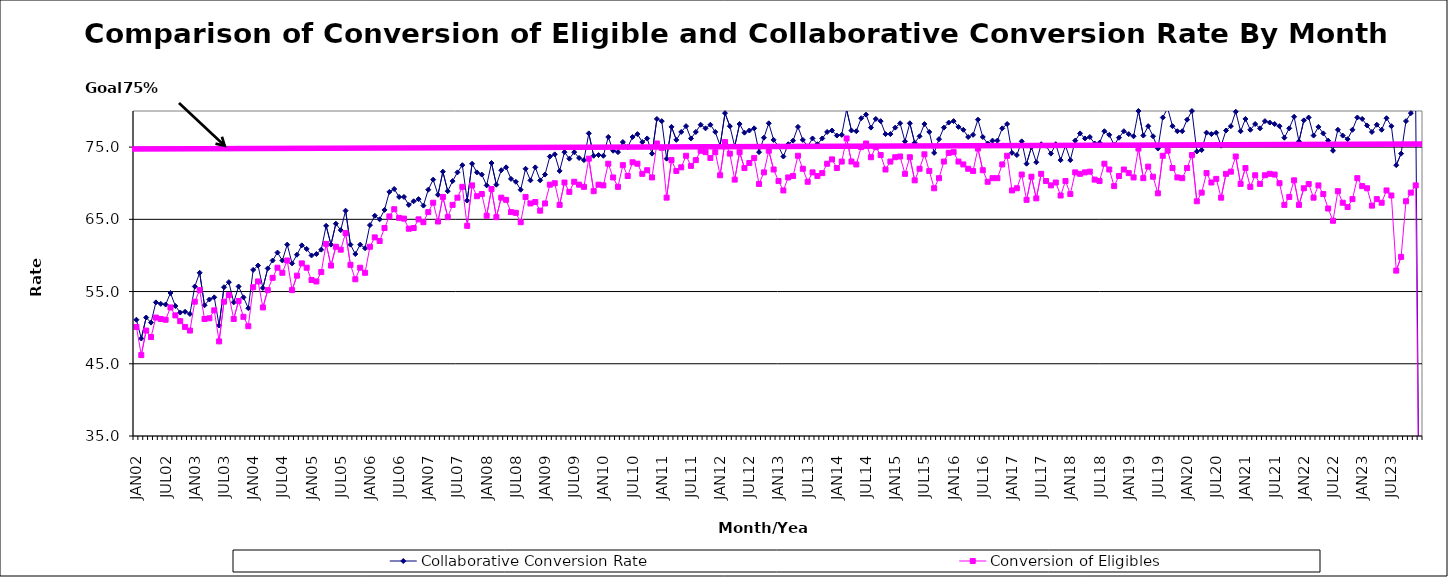
| Category | Collaborative Conversion Rate | Conversion of Eligibles |
|---|---|---|
| JAN02 | 51.1 | 50.1 |
| FEB02 | 48.5 | 46.2 |
| MAR02 | 51.4 | 49.6 |
| APR02 | 50.7 | 48.7 |
| MAY02 | 53.5 | 51.4 |
| JUN02 | 53.3 | 51.2 |
| JUL02 | 53.2 | 51.1 |
| AUG02 | 54.8 | 52.8 |
| SEP02 | 53 | 51.7 |
| OCT02 | 52.1 | 50.9 |
| NOV02 | 52.2 | 50.1 |
| DEC02 | 51.9 | 49.6 |
| JAN03 | 55.7 | 53.6 |
| FEB03 | 57.6 | 55.2 |
| MAR03 | 53.1 | 51.2 |
| APR03 | 53.9 | 51.3 |
| MAY03 | 54.2 | 52.4 |
| JUN03 | 50.3 | 48.1 |
| JUL03 | 55.6 | 53.6 |
| AUG03 | 56.3 | 54.5 |
| SEP03 | 53.5 | 51.2 |
| OCT03 | 55.7 | 53.7 |
| NOV03 | 54.2 | 51.5 |
| DEC03 | 52.7 | 50.2 |
| JAN04 | 58 | 55.6 |
| FEB04 | 58.6 | 56.4 |
| MAR04 | 55.5 | 52.8 |
| APR04 | 58.2 | 55.2 |
| MAY04 | 59.3 | 56.9 |
| JUN04 | 60.4 | 58.3 |
| JUL04 | 59.3 | 57.6 |
| AUG04 | 61.5 | 59.3 |
| SEP04 | 58.9 | 55.2 |
| OCT04 | 60.1 | 57.2 |
| NOV04 | 61.4 | 58.9 |
| DEC04 | 60.9 | 58.3 |
| JAN05 | 60 | 56.6 |
| FEB05 | 60.2 | 56.4 |
| MAR05 | 60.8 | 57.7 |
| APR05 | 64.1 | 61.6 |
| MAY05 | 61.5 | 58.6 |
| JUN05 | 64.4 | 61.2 |
| JUL05 | 63.5 | 60.8 |
| AUG05 | 66.2 | 63.1 |
| SEP05 | 61.5 | 58.7 |
| OCT05 | 60.2 | 56.7 |
| NOV05 | 61.5 | 58.3 |
| DEC05 | 61 | 57.6 |
| JAN06 | 64.2 | 61.2 |
| FEB06 | 65.5 | 62.5 |
| MAR06 | 65 | 62 |
| APR06 | 66.3 | 63.8 |
| MAY06 | 68.8 | 65.4 |
| JUN06 | 69.2 | 66.4 |
| JUL06 | 68.1 | 65.2 |
| AUG06 | 68.1 | 65.1 |
| SEP06 | 67 | 63.7 |
| OCT06 | 67.5 | 63.8 |
| NOV06 | 67.8 | 65 |
| DEC06 | 66.9 | 64.6 |
| JAN07 | 69.1 | 66 |
| FEB07 | 70.5 | 67.3 |
| MAR07 | 68.4 | 64.7 |
| APR07 | 71.6 | 68.1 |
| MAY07 | 68.9 | 65.3 |
| JUN07 | 70.3 | 67 |
| JUL07 | 71.5 | 68 |
| AUG07 | 72.5 | 69.5 |
| SEP07 | 67.6 | 64.1 |
| OCT07 | 72.7 | 69.7 |
| NOV07 | 71.5 | 68.2 |
| DEC07 | 71.2 | 68.5 |
| JAN08 | 69.7 | 65.5 |
| FEB08 | 72.8 | 69.2 |
| MAR08 | 69.8 | 65.3 |
| APR08 | 71.8 | 68 |
| MAY08 | 72.2 | 67.7 |
| JUN08 | 70.6 | 66 |
| JUL08 | 70.2 | 65.9 |
| AUG08 | 69.1 | 64.6 |
| SEP08 | 72 | 68.1 |
| OCT08 | 70.4 | 67.2 |
| NOV08 | 72.2 | 67.4 |
| DEC08 | 70.4 | 66.2 |
| JAN09 | 71.2 | 67.2 |
| FEB09 | 73.7 | 69.8 |
| MAR09 | 74 | 70 |
| APR09 | 71.7 | 67 |
| MAY09 | 74.3 | 70.1 |
| JUN09 | 73.4 | 68.8 |
| JUL09 | 74.3 | 70.2 |
| AUG09 | 73.5 | 69.8 |
| SEP09 | 73.2 | 69.5 |
| OCT09 | 76.9 | 73.4 |
| NOV09 | 73.8 | 68.9 |
| DEC09 | 73.9 | 69.8 |
| JAN10 | 73.8 | 69.7 |
| FEB10 | 76.4 | 72.7 |
| MAR10 | 74.5 | 70.8 |
| APR10 | 74.3 | 69.5 |
| MAY10 | 75.7 | 72.5 |
| JUN10 | 75 | 71 |
| JUL10 | 76.4 | 72.9 |
| AUG10 | 76.8 | 72.7 |
| SEP10 | 75.7 | 71.3 |
| OCT10 | 76.2 | 71.8 |
| NOV10 | 74.1 | 70.8 |
| DEC10 | 78.9 | 75.5 |
| JAN11 | 78.6 | 74.9 |
| FEB11 | 73.4 | 68 |
| MAR11 | 77.8 | 73.2 |
| APR11 | 76 | 71.7 |
| MAY11 | 77.1 | 72.2 |
| JUN11 | 77.9 | 73.8 |
| JUL11 | 76.2 | 72.4 |
| AUG11 | 77.1 | 73.2 |
| SEP11 | 78.1 | 74.5 |
| OCT11 | 77.6 | 74.3 |
| NOV11 | 78.1 | 73.5 |
| DEC11 | 77.1 | 74.3 |
| JAN12 | 75.2 | 71.1 |
| FEB12 | 79.7 | 75.7 |
| MAR12 | 77.9 | 74.1 |
| APR12 | 75.1 | 70.5 |
| MAY12 | 78.2 | 74.3 |
| JUN12 | 77 | 72.1 |
| JUL12 | 77.3 | 72.8 |
| AUG12 | 77.6 | 73.5 |
| SEP12 | 74.3 | 69.9 |
| OCT12 | 76.3 | 71.5 |
| NOV12 | 78.3 | 74.5 |
| DEC12 | 76 | 71.9 |
| JAN13 | 75.1 | 70.3 |
| FEB13 | 73.7 | 69 |
| MAR13 | 75.4 | 70.8 |
| APR13 | 75.9 | 71 |
| MAY13 | 77.8 | 73.8 |
| JUN13 | 76 | 72 |
| JUL13 | 75.1 | 70.2 |
| AUG13 | 76.2 | 71.5 |
| SEP13 | 75.4 | 71 |
| OCT13 | 76.2 | 71.4 |
| NOV13 | 77.1 | 72.7 |
| DEC13 | 77.3 | 73.3 |
| JAN14 | 76.6 | 72.1 |
| FEB14 | 76.7 | 73 |
| MAR14 | 80.2 | 76.2 |
| APR14 | 77.3 | 73 |
| MAY14 | 77.2 | 72.6 |
| JUN14 | 79 | 75 |
| JUL14 | 79.5 | 75.5 |
| AUG14 | 77.7 | 73.6 |
| SEP14 | 78.9 | 75 |
| OCT14 | 78.6 | 73.9 |
| NOV14 | 76.8 | 71.9 |
| DEC14 | 76.8 | 73 |
| JAN15 | 77.7 | 73.6 |
| FEB15 | 78.3 | 73.7 |
| MAR15 | 75.8 | 71.3 |
| APR15 | 78.3 | 73.6 |
| MAY15 | 75.6 | 70.4 |
| JUN15 | 76.5 | 72 |
| JUL15 | 78.2 | 74 |
| AUG15 | 77.1 | 71.7 |
| SEP15 | 74.2 | 69.3 |
| OCT15 | 76.1 | 70.7 |
| NOV15 | 77.7 | 73 |
| DEC15 | 78.4 | 74.2 |
| JAN16 | 78.6 | 74.3 |
| FEB16 | 77.8 | 73 |
| MAR16 | 77.4 | 72.6 |
| APR16 | 76.4 | 72 |
| MAY16 | 76.7 | 71.7 |
| JUN16 | 78.8 | 74.8 |
| JUL16 | 76.4 | 71.8 |
| AUG16 | 75.5 | 70.2 |
| SEP16 | 75.9 | 70.7 |
| OCT16 | 75.9 | 70.7 |
| NOV16 | 77.6 | 72.6 |
| DEC16 | 78.2 | 73.8 |
| JAN17 | 74.2 | 69 |
| FEB17 | 73.9 | 69.3 |
| MAR17 | 75.8 | 71.2 |
| APR17 | 72.7 | 67.7 |
| MAY17 | 75 | 70.9 |
| JUN17 | 72.9 | 67.9 |
| JUL17 | 75.4 | 71.3 |
| AUG17 | 75.2 | 70.3 |
| SEP17 | 74.1 | 69.7 |
| OCT17 | 75.4 | 70.1 |
| NOV17 | 73.2 | 68.3 |
| DEC17 | 75.2 | 70.3 |
| JAN18 | 73.2 | 68.5 |
| FEB18 | 75.9 | 71.5 |
| MAR18 | 76.9 | 71.3 |
| APR18 | 76.2 | 71.5 |
| MAY18 | 76.4 | 71.6 |
| JUN18 | 75.5 | 70.5 |
| JUL18 | 75.6 | 70.3 |
| AUG18 | 77.2 | 72.7 |
| SEP18 | 76.7 | 71.9 |
| OCT18 | 75.3 | 69.6 |
| NOV18 | 76.3 | 71 |
| DEC18 | 77.2 | 71.9 |
| JAN19 | 76.8 | 71.4 |
| FEB19 | 76.5 | 70.8 |
| MAR19 | 80 | 74.8 |
| APR19 | 76.6 | 70.7 |
| MAY19 | 77.9 | 72.3 |
| JUN19 | 76.5 | 70.9 |
| JUL19 | 74.8 | 68.6 |
| AUG19 | 79.1 | 73.8 |
| SEP19 | 80.4 | 74.5 |
| OCT19 | 77.9 | 72.1 |
| NOV19 | 77.2 | 70.8 |
| DEC19 | 77.2 | 70.7 |
| JAN20 | 78.8 | 72.1 |
| FEB20 | 80 | 73.9 |
| MAR20 | 74.4 | 67.5 |
| APR20 | 74.6 | 68.7 |
| MAY20 | 77 | 71.4 |
| JUN20 | 76.8 | 70.1 |
| JUL20 | 77 | 70.6 |
| AUG20 | 75.2 | 68 |
| SEP20 | 77.3 | 71.3 |
| OCT20 | 77.9 | 71.6 |
| NOV20 | 79.9 | 73.7 |
| DEC20 | 77.2 | 69.9 |
| JAN21 | 78.9 | 72.1 |
| FEB21 | 77.4 | 69.5 |
| MAR21 | 78.2 | 71.1 |
| APR21 | 77.6 | 69.9 |
| MAY21 | 78.6 | 71.1 |
| JUN21 | 78.4 | 71.3 |
| JUL21 | 78.2 | 71.2 |
| AUG21 | 77.9 | 70 |
| SEP21 | 76.3 | 67 |
| OCT21 | 77.6 | 68.1 |
| NOV21 | 79.2 | 70.4 |
| DEC21 | 75.8 | 67 |
| JAN22 | 78.7 | 69.3 |
| FEB22 | 79.1 | 69.9 |
| MAR22 | 76.6 | 68 |
| APR22 | 77.8 | 69.7 |
| MAY22 | 76.9 | 68.5 |
| JUN22 | 75.9 | 66.5 |
| JUL22 | 74.5 | 64.8 |
| AUG22 | 77.4 | 68.9 |
| SEP22 | 76.6 | 67.3 |
| OCT22 | 76.1 | 66.7 |
| NOV22 | 77.4 | 67.8 |
| DEC22 | 79.1 | 70.7 |
| JAN23 | 78.9 | 69.6 |
| FEB23 | 78 | 69.3 |
| MAR23 | 77.1 | 66.9 |
| APR23 | 78.1 | 67.8 |
| MAY23 | 77.4 | 67.3 |
| JUN23 | 79 | 69 |
| JUL23 | 77.9 | 68.3 |
| AUG23 | 72.5 | 57.9 |
| SEP23 | 74.1 | 59.8 |
| OCT23 | 78.6 | 67.5 |
| NOV23 | 79.7 | 68.7 |
| DEC23 | 80.6 | 69.7 |